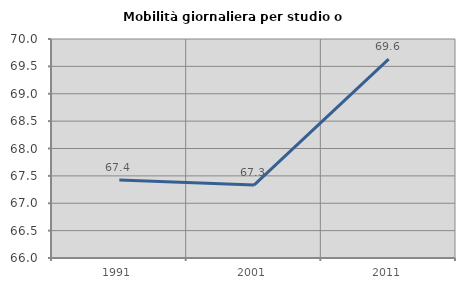
| Category | Mobilità giornaliera per studio o lavoro |
|---|---|
| 1991.0 | 67.425 |
| 2001.0 | 67.332 |
| 2011.0 | 69.634 |